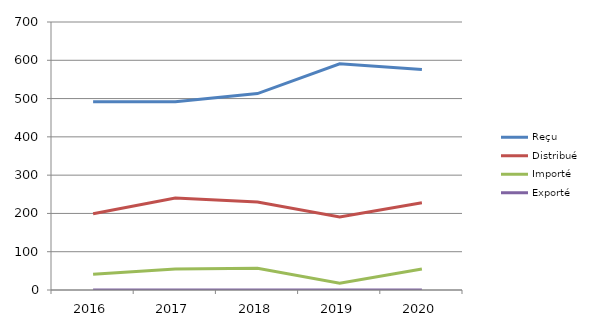
| Category | Reçu | Distribué | Importé | Exporté |
|---|---|---|---|---|
| 2016.0 | 492 | 199 | 41 | 0 |
| 2017.0 | 492 | 240 | 55 | 0 |
| 2018.0 | 513 | 230 | 57 | 0 |
| 2019.0 | 591 | 191 | 18 | 0 |
| 2020.0 | 576 | 228 | 55 | 0 |